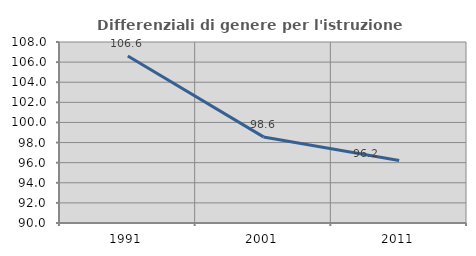
| Category | Differenziali di genere per l'istruzione superiore |
|---|---|
| 1991.0 | 106.616 |
| 2001.0 | 98.561 |
| 2011.0 | 96.206 |